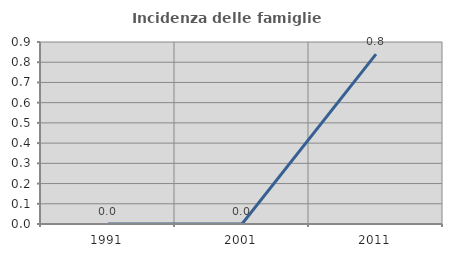
| Category | Incidenza delle famiglie numerose |
|---|---|
| 1991.0 | 0 |
| 2001.0 | 0 |
| 2011.0 | 0.84 |